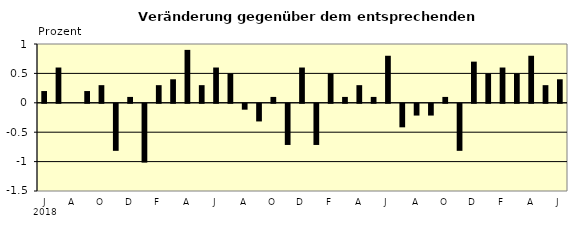
| Category | Series 0 |
|---|---|
| 0 | 0.2 |
| 1 | 0.6 |
| 2 | 0 |
| 3 | 0.2 |
| 4 | 0.3 |
| 5 | -0.8 |
| 6 | 0.1 |
| 7 | -1 |
| 8 | 0.3 |
| 9 | 0.4 |
| 10 | 0.9 |
| 11 | 0.3 |
| 12 | 0.6 |
| 13 | 0.5 |
| 14 | -0.1 |
| 15 | -0.3 |
| 16 | 0.1 |
| 17 | -0.7 |
| 18 | 0.6 |
| 19 | -0.7 |
| 20 | 0.5 |
| 21 | 0.1 |
| 22 | 0.3 |
| 23 | 0.1 |
| 24 | 0.8 |
| 25 | -0.4 |
| 26 | -0.2 |
| 27 | -0.2 |
| 28 | 0.1 |
| 29 | -0.8 |
| 30 | 0.7 |
| 31 | 0.5 |
| 32 | 0.6 |
| 33 | 0.5 |
| 34 | 0.8 |
| 35 | 0.3 |
| 36 | 0.4 |